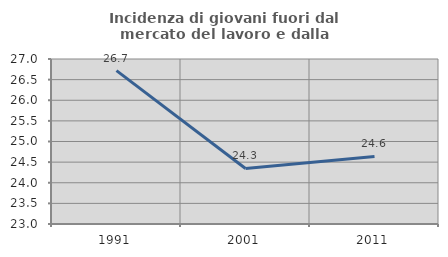
| Category | Incidenza di giovani fuori dal mercato del lavoro e dalla formazione  |
|---|---|
| 1991.0 | 26.718 |
| 2001.0 | 24.346 |
| 2011.0 | 24.639 |